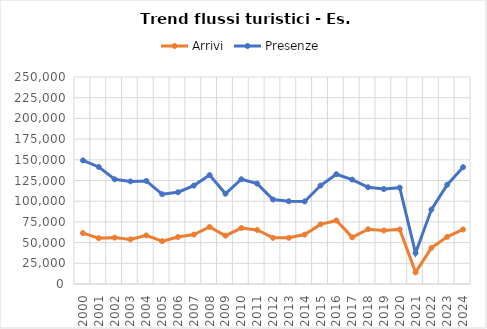
| Category | Arrivi | Presenze |
|---|---|---|
| 2000.0 | 61480 | 149248 |
| 2001.0 | 55345 | 141378 |
| 2002.0 | 56006 | 126460 |
| 2003.0 | 53890 | 123943 |
| 2004.0 | 58717 | 124501 |
| 2005.0 | 51718 | 108448 |
| 2006.0 | 56758 | 110830 |
| 2007.0 | 59736 | 118884 |
| 2008.0 | 68837 | 131520 |
| 2009.0 | 58323 | 108994 |
| 2010.0 | 67561 | 126514 |
| 2011.0 | 65216 | 121234 |
| 2012.0 | 55755 | 102084 |
| 2013.0 | 55806 | 99872 |
| 2014.0 | 59718 | 99695 |
| 2015.0 | 72003 | 118887 |
| 2016.0 | 76751 | 132563 |
| 2017.0 | 56360 | 126099 |
| 2018.0 | 66132 | 116855 |
| 2019.0 | 64669 | 114632 |
| 2020.0 | 65890 | 116385 |
| 2021.0 | 14111 | 37421 |
| 2022.0 | 43677 | 89884 |
| 2023.0 | 56965 | 119950 |
| 2024.0 | 65842 | 141129 |